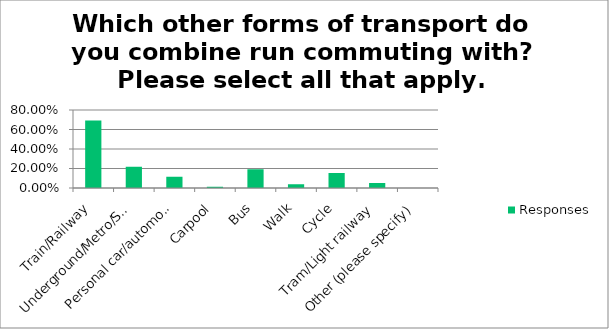
| Category | Responses |
|---|---|
| Train/Railway | 0.692 |
| Underground/Metro/Subway | 0.218 |
| Personal car/automobile | 0.115 |
| Carpool | 0.013 |
| Bus | 0.192 |
| Walk | 0.038 |
| Cycle | 0.154 |
| Tram/Light railway | 0.051 |
| Other (please specify) | 0 |